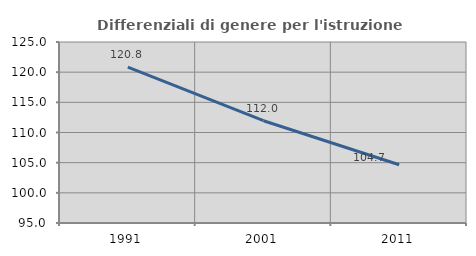
| Category | Differenziali di genere per l'istruzione superiore |
|---|---|
| 1991.0 | 120.822 |
| 2001.0 | 111.954 |
| 2011.0 | 104.654 |